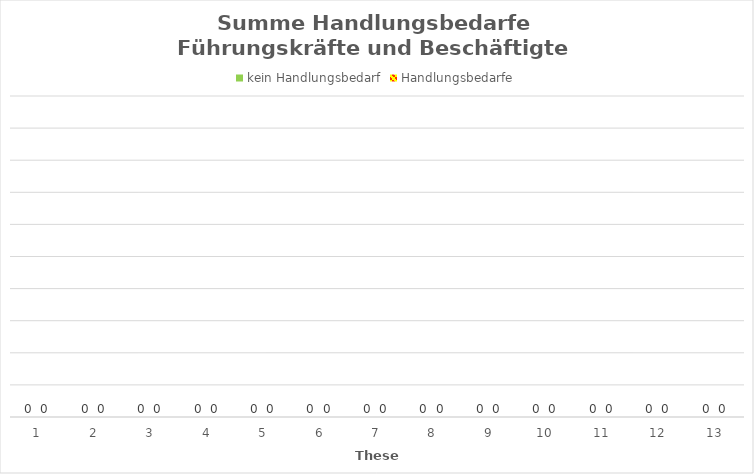
| Category | kein Handlungsbedarf | Handlungsbedarfe |
|---|---|---|
| 1.0 | 0 | 0 |
| 2.0 | 0 | 0 |
| 3.0 | 0 | 0 |
| 4.0 | 0 | 0 |
| 5.0 | 0 | 0 |
| 6.0 | 0 | 0 |
| 7.0 | 0 | 0 |
| 8.0 | 0 | 0 |
| 9.0 | 0 | 0 |
| 10.0 | 0 | 0 |
| 11.0 | 0 | 0 |
| 12.0 | 0 | 0 |
| 13.0 | 0 | 0 |